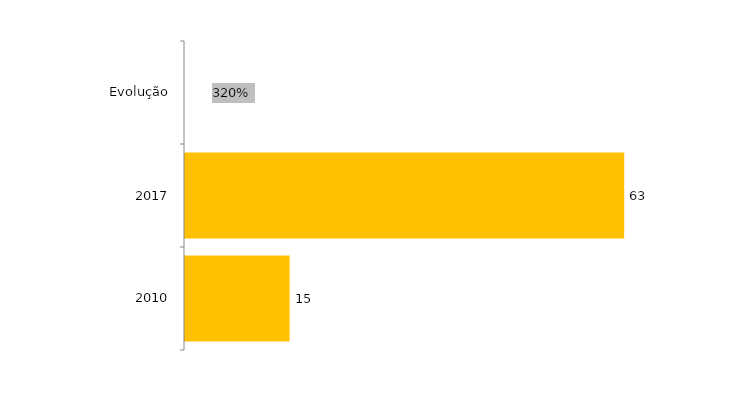
| Category | Evolução Matriculados |
|---|---|
| 2010 | 15 |
| 2017 | 63 |
| Evolução | 3.2 |